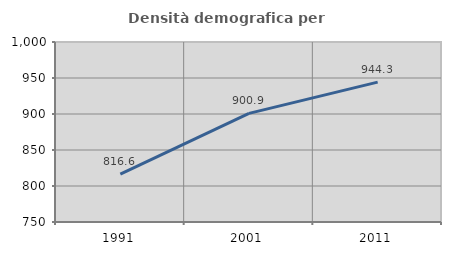
| Category | Densità demografica |
|---|---|
| 1991.0 | 816.64 |
| 2001.0 | 900.912 |
| 2011.0 | 944.308 |